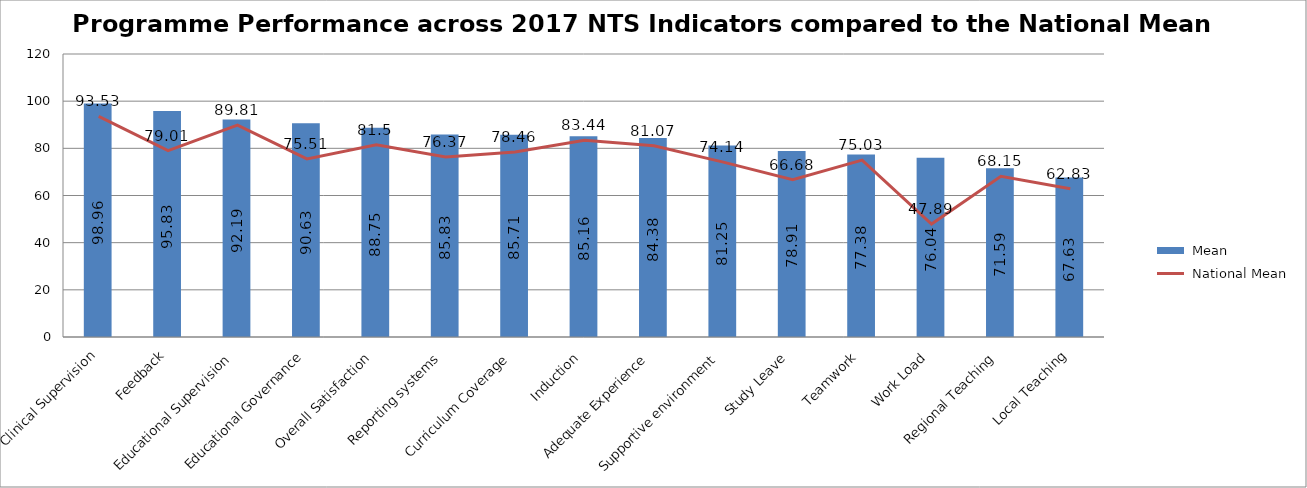
| Category |  Mean |
|---|---|
| Clinical Supervision | 98.96 |
| Feedback | 95.83 |
| Educational Supervision | 92.19 |
| Educational Governance | 90.63 |
| Overall Satisfaction | 88.75 |
| Reporting systems | 85.83 |
| Curriculum Coverage | 85.71 |
| Induction | 85.16 |
| Adequate Experience | 84.38 |
| Supportive environment | 81.25 |
| Study Leave | 78.91 |
| Teamwork | 77.38 |
| Work Load | 76.04 |
| Regional Teaching | 71.59 |
| Local Teaching | 67.63 |